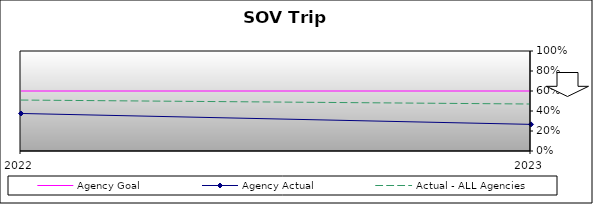
| Category | Agency Goal | Agency Actual | Actual - ALL Agencies |
|---|---|---|---|
| 2022.0 | 0.6 | 0.375 | 0.509 |
| 2023.0 | 0.6 | 0.266 | 0.47 |